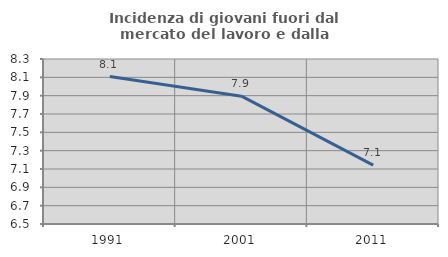
| Category | Incidenza di giovani fuori dal mercato del lavoro e dalla formazione  |
|---|---|
| 1991.0 | 8.108 |
| 2001.0 | 7.895 |
| 2011.0 | 7.143 |